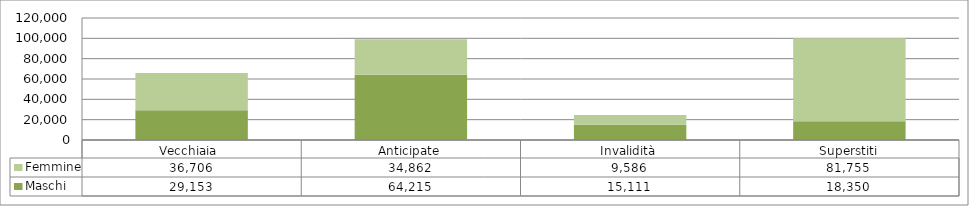
| Category | Maschi | Femmine |
|---|---|---|
| Vecchiaia  | 29153 | 36706 |
| Anticipate | 64215 | 34862 |
| Invalidità | 15111 | 9586 |
| Superstiti | 18350 | 81755 |